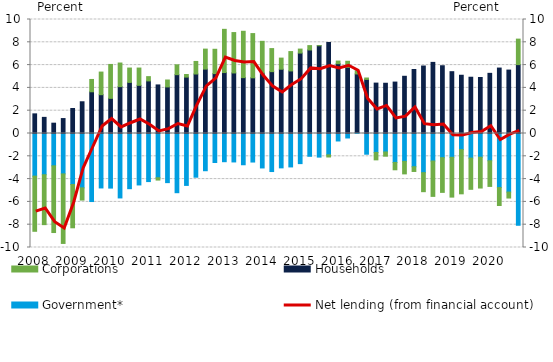
| Category | Government* | Households | Corporations |
|---|---|---|---|
| 2008.0 | -3.74 | 1.722 | -4.839 |
| nan | -3.619 | 1.415 | -4.375 |
| nan | -2.834 | 0.905 | -5.853 |
| nan | -3.544 | 1.31 | -6.1 |
| 2009.0 | -4.472 | 2.195 | -3.8 |
| nan | -4.768 | 2.783 | -1.071 |
| nan | -5.969 | 3.659 | 1.081 |
| nan | -4.777 | 3.404 | 1.984 |
| 2010.0 | -4.789 | 3.083 | 2.974 |
| nan | -5.653 | 4.111 | 2.071 |
| nan | -4.841 | 4.481 | 1.26 |
| nan | -4.513 | 4.226 | 1.516 |
| 2011.0 | -4.218 | 4.614 | 0.375 |
| nan | -3.88 | 4.261 | -0.204 |
| nan | -4.31 | 4.086 | 0.607 |
| nan | -5.194 | 5.161 | 0.865 |
| 2012.0 | -4.553 | 4.947 | 0.23 |
| nan | -3.834 | 5.218 | 1.102 |
| nan | -3.266 | 5.649 | 1.754 |
| nan | -2.545 | 5.254 | 2.135 |
| 2013.0 | -2.474 | 5.346 | 3.791 |
| nan | -2.495 | 5.31 | 3.543 |
| nan | -2.742 | 4.901 | 4.066 |
| nan | -2.503 | 4.886 | 3.879 |
| 2014.0 | -3.022 | 5.296 | 2.79 |
| nan | -3.337 | 5.426 | 2.023 |
| nan | -3.015 | 5.636 | 0.977 |
| nan | -2.932 | 5.487 | 1.699 |
| 2015.0 | -2.642 | 7.056 | 0.349 |
| nan | -1.999 | 7.327 | 0.382 |
| nan | -2.071 | 7.7 | 0.007 |
| nan | -1.871 | 7.983 | -0.189 |
| 2016.0 | -0.656 | 6.123 | 0.232 |
| nan | -0.393 | 5.805 | 0.53 |
| nan | 0.088 | 5.137 | 0.278 |
| nan | -1.817 | 4.744 | 0.124 |
| 2017.0 | -1.661 | 4.42 | -0.651 |
| nan | -1.62 | 4.407 | -0.37 |
| nan | -2.541 | 4.511 | -0.642 |
| nan | -2.447 | 5.019 | -1.096 |
| 2018.0 | -2.918 | 5.613 | -0.413 |
| nan | -3.435 | 5.92 | -1.669 |
| nan | -2.415 | 6.238 | -3.101 |
| nan | -2.122 | 5.943 | -3.043 |
| 2019.0 | -2.089 | 5.422 | -3.49 |
| nan | -1.413 | 5.11 | -3.88 |
| nan | -2.158 | 4.935 | -2.738 |
| nan | -2.081 | 4.912 | -2.703 |
| 2020.0 | -2.392 | 5.277 | -2.25 |
| nan | -4.743 | 5.74 | -1.574 |
| nan | -5.139 | 5.564 | -0.521 |
| nan | -8.05 | 6.042 | 2.237 |